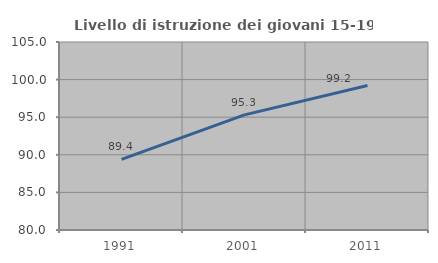
| Category | Livello di istruzione dei giovani 15-19 anni |
|---|---|
| 1991.0 | 89.394 |
| 2001.0 | 95.312 |
| 2011.0 | 99.225 |